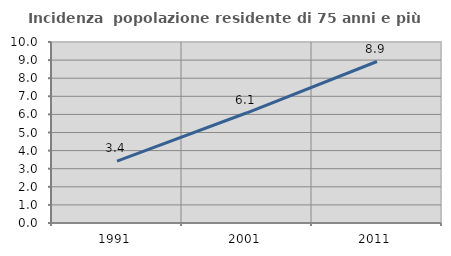
| Category | Incidenza  popolazione residente di 75 anni e più |
|---|---|
| 1991.0 | 3.417 |
| 2001.0 | 6.09 |
| 2011.0 | 8.923 |